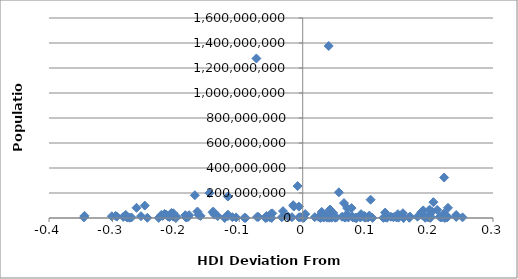
| Category | Population |
|---|---|
| 0.2280000000000001 | 5707251 |
| 0.19800000000000006 | 5488543 |
| 0.21600000000000008 | 9875378 |
| 0.21800000000000008 | 4691480 |
| 0.2270000000000001 | 17000059 |
| 0.252 | 5214900 |
| 0.242 | 8211700 |
| 0.2280000000000001 | 8211700 |
| 0.2230000000000001 | 36048521 |
| 0.2290000000000001 | 81459000 |
| 0.20100000000000007 | 562958 |
| 0.21200000000000008 | 64716000 |
| 0.242 | 24104700 |
| 0.2240000000000001 | 332529 |
| 0.19900000000000007 | 11250585 |
| 0.19600000000000006 | 8662588 |
| 0.2230000000000001 | 323625762 |
| 0.22000000000000008 | 7234800 |
| 0.2260000000000001 | 6378000 |
| 0.20600000000000007 | 126919659 |
| 0.09800000000000009 | 3324460 |
| 0.15900000000000003 | 2545603 |
| 0.15000000000000002 | 18006407 |
| 0.16800000000000004 | 1315944 |
| 0.20000000000000007 | 66689000 |
| 0.14300000000000002 | 5779760 |
| -0.08999999999999997 | 742737 |
| 0.0010000000000000009 | 2155784 |
| 0.14600000000000002 | 10427301 |
| 0.15800000000000003 | 38483957 |
| 0.18800000000000006 | 23476640 |
| 0.15900000000000003 | 1141166 |
| 0.20200000000000007 | 8502900 |
| 0.15100000000000002 | 2875593 |
| 0.19300000000000006 | 2063077 |
| 0.18700000000000006 | 46423064 |
| 0.18100000000000005 | 10553443 |
| 0.20400000000000007 | 50801405 |
| 0.15900000000000003 | 445426 |
| -0.04899999999999993 | 525000 |
| 0.07900000000000007 | 4586353 |
| 0.133 | 1973700 |
| 0.08500000000000008 | 92000 |
| -0.19899999999999995 | 11262564 |
| 0.04400000000000004 | 9531712 |
| 0.08400000000000007 | 1261208 |
| -0.05699999999999994 | 2113077 |
| 0.07200000000000006 | 3720400 |
| 0.15000000000000002 | 30770375 |
| 0.127 | 1343000 |
| 0.13 | 4284889 |
| 0.139 | 9855571 |
| 0.14800000000000002 | 5426252 |
| 0.09200000000000008 | 31068000 |
| 0.10300000000000009 | 4187161 |
| 0.07800000000000007 | 11238317 |
| -0.118 | 27000000 |
| 0.16900000000000004 | 10955000 |
| 0.1050000000000001 | 19511000 |
| 0.09900000000000009 | 3286936 |
| 0.19000000000000006 | 60674003 |
| -0.19999999999999996 | 2067000 |
| 0.1100000000000001 | 676872 |
| -0.20299999999999996 | 13567338 |
| -0.030999999999999917 | 54956900 |
| -0.123 | 190428 |
| 0.051000000000000045 | 2069162 |
| 0.07000000000000006 | 79463663 |
| 0.09700000000000009 | 7202198 |
| 0.03300000000000003 | 2950210 |
| 0.07900000000000007 | 7041599 |
| -0.016999999999999904 | 6377195 |
| 0.038000000000000034 | 3081677 |
| 0.09100000000000008 | 3929141 |
| 0.08300000000000007 | 1349667 |
| 0.05300000000000005 | 3871643 |
| 0.05700000000000005 | 205338000 |
| -0.29499999999999993 | 17322796 |
| -0.07299999999999995 | 1276267000 |
| 0.04300000000000004 | 67959000 |
| 0.028000000000000025 | 10982754 |
| -0.118 | 16212000 |
| -0.21199999999999997 | 10879829 |
| 0.041000000000000036 | 1376049000 |
| 0.030000000000000027 | 48663285 |
| -0.26999999999999996 | 4503000 |
| 0.06900000000000006 | 20277597 |
| 0.06700000000000006 | 2886026 |
| 0.04800000000000004 | 40400000 |
| -0.006000000000000005 | 91162000 |
| -0.008000000000000007 | 255461700 |
| -0.04999999999999993 | 33848242 |
| 0.04300000000000004 | 31151643 |
| 0.028000000000000025 | 573311 |
| 0.04600000000000004 | 2998600 |
| -0.25499999999999995 | 14517176 |
| 0.06500000000000006 | 119530753 |
| -0.014999999999999902 | 102580000 |
| -0.02299999999999991 | 11410651 |
| -0.22699999999999998 | 828324 |
| 0.0 | 1475000 |
| -0.344 | 17138707 |
| 0.025000000000000022 | 9980243 |
| -0.24899999999999994 | 99465819 |
| 0.04200000000000004 | 1859203 |
| 0.0020000000000000018 | 2913281 |
| 0.13 | 43417000 |
| 0.09900000000000009 | 9498700 |
| -0.22299999999999998 | 23919000 |
| 0.04200000000000004 | 16144000 |
| -0.20999999999999996 | 7552318 |
| -0.07199999999999995 | 8249574 |
| -0.22099999999999997 | 16407000 |
| -0.18399999999999994 | 4067564 |
| -0.27899999999999997 | 24692144 |
| -0.013999999999999901 | 91700000 |
| -0.1469999999999999 | 199085847 |
| -0.16599999999999993 | 51820000 |
| 0.062000000000000055 | 9754830 |
| -0.05899999999999994 | 735554 |
| 0.1070000000000001 | 146600000 |
| -0.27699999999999997 | 6190280 |
| -0.24499999999999994 | 1882450 |
| -0.05699999999999994 | 15806675 |
| 0.09700000000000009 | 17693500 |
| -0.03299999999999992 | 6000000 |
| 0.06600000000000006 | 4467000 |
| -0.18499999999999994 | 22434363 |
| -0.09199999999999997 | 1201542 |
| -0.17899999999999994 | 22534532 |
| 0.07700000000000007 | 79200000 |
| -0.1389999999999999 | 26494504 |
| -0.051999999999999935 | 6167237 |
| -0.0040000000000000036 | 6783272 |
| 0.04600000000000004 | 42539010 |
| -0.19999999999999996 | 798000 |
| -0.16999999999999993 | 182202000 |
| -0.06999999999999995 | 8610000 |
| -0.118 | 171700000 |
| -0.283 | 8746128 |
| -0.1419999999999999 | 45010056 |
| -0.11099999999999999 | 6803699 |
| -0.18099999999999994 | 7059653 |
| -0.20399999999999996 | 37873253 |
| -0.345 | 4709000 |
| -0.10499999999999998 | 4662446 |
| -0.30099999999999993 | 13670084 |
| -0.26199999999999996 | 81680000 |
| -0.1409999999999999 | 51486253 |
| -0.2929999999999999 | 11178921 |
| -0.134 | 15458332 |
| -0.18099999999999994 | 12973808 |
| 0.0040000000000000036 | 31576400 |
| -0.27699999999999997 | 6380803 |
| -0.16099999999999992 | 17064854 |
| -0.006000000000000005 | 5171943 |
| -0.21499999999999997 | 25408000 |
| -0.20399999999999996 | 10604000 |
| -0.27299999999999996 | 1693398 |
| 0.07000000000000006 | 31416000 |
| -0.04799999999999993 | 37056169 |
| 0.019000000000000017 | 6411776 |
| -0.16399999999999992 | 24383301 |
| -0.27899999999999997 | 12340000 |
| -0.20699999999999996 | 40235000 |
| -0.21799999999999997 | 32564342 |
| 0.03600000000000003 | 24895000 |